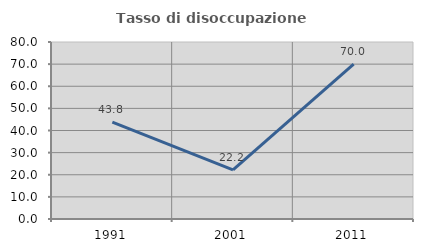
| Category | Tasso di disoccupazione giovanile  |
|---|---|
| 1991.0 | 43.75 |
| 2001.0 | 22.222 |
| 2011.0 | 70 |